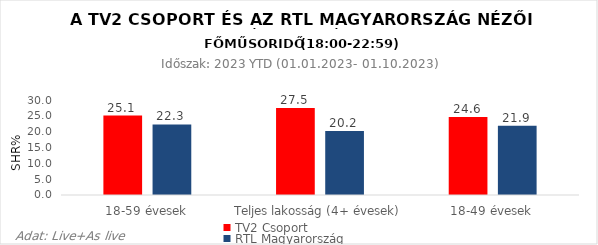
| Category | TV2 Csoport | RTL Magyarország |
|---|---|---|
| 18-59 évesek | 25.1 | 22.3 |
| Teljes lakosság (4+ évesek) | 27.5 | 20.2 |
| 18-49 évesek | 24.6 | 21.9 |